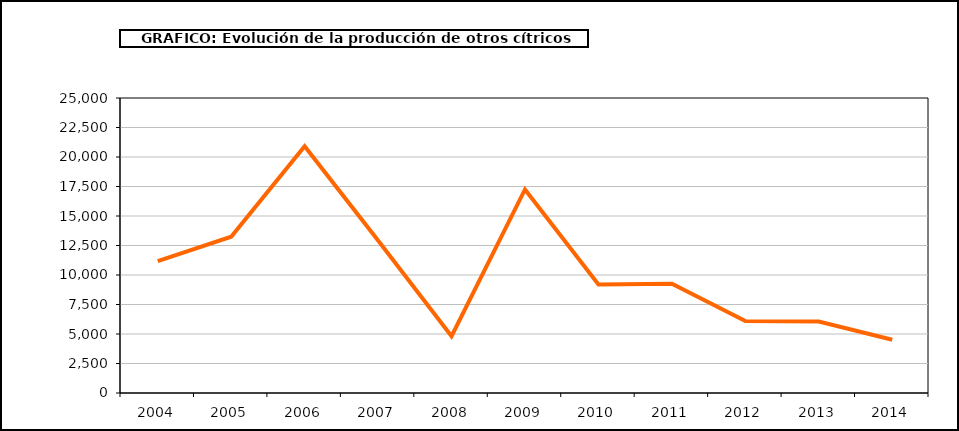
| Category | producción |
|---|---|
| 2004.0 | 11182 |
| 2005.0 | 13248 |
| 2006.0 | 20917 |
| 2007.0 | 12921 |
| 2008.0 | 4816 |
| 2009.0 | 17251 |
| 2010.0 | 9197 |
| 2011.0 | 9260 |
| 2012.0 | 6091 |
| 2013.0 | 6060 |
| 2014.0 | 4514 |